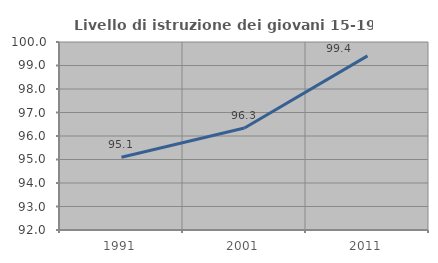
| Category | Livello di istruzione dei giovani 15-19 anni |
|---|---|
| 1991.0 | 95.094 |
| 2001.0 | 96.341 |
| 2011.0 | 99.408 |